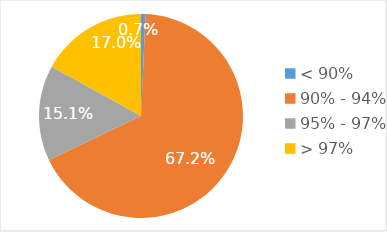
| Category | Доля, % |
|---|---|
| < 90% | 0.007 |
| 90% - 94% | 0.672 |
| 95% - 97% | 0.151 |
| > 97% | 0.17 |